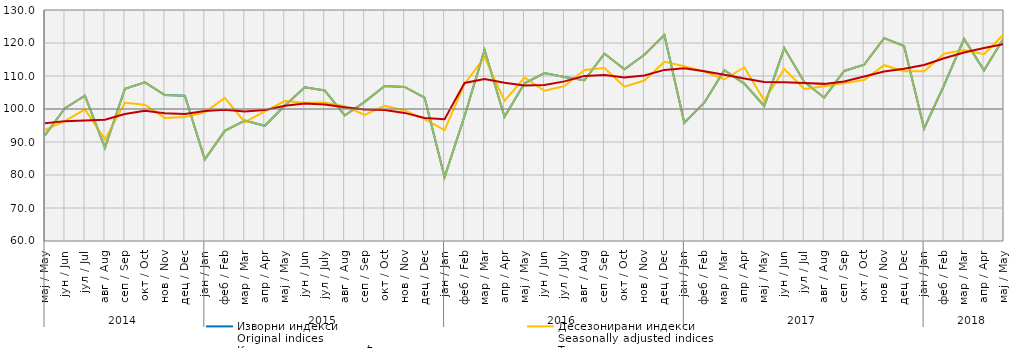
| Category | Изворни индекси
Original indices | Десезонирани индекси
Seasonally adjusted indices | Календарски прилагођени индекси
Working-day adjusted indices | Тренд
Trend |
|---|---|---|---|---|
| 0 | 92.073 | 93.652 | 92.073 | 95.713 |
| 1 | 100.223 | 96.353 | 100.223 | 96.325 |
| 2 | 104.036 | 99.883 | 104.036 | 96.519 |
| 3 | 88.225 | 90.789 | 88.225 | 96.746 |
| 4 | 106.132 | 101.86 | 106.132 | 98.466 |
| 5 | 108.074 | 101.318 | 108.074 | 99.43 |
| 6 | 104.242 | 97.289 | 104.242 | 98.74 |
| 7 | 104.032 | 97.553 | 104.032 | 98.503 |
| 8 | 84.716 | 98.988 | 84.716 | 99.367 |
| 9 | 93.365 | 103.385 | 93.365 | 99.771 |
| 10 | 96.491 | 95.997 | 96.491 | 99.22 |
| 11 | 94.914 | 99.28 | 94.914 | 99.662 |
| 12 | 101.001 | 102.419 | 101.001 | 101.003 |
| 13 | 106.571 | 101.867 | 106.571 | 101.669 |
| 14 | 105.634 | 101.936 | 105.634 | 101.375 |
| 15 | 98.032 | 100.837 | 98.032 | 100.512 |
| 16 | 102.175 | 98.177 | 102.175 | 99.874 |
| 17 | 106.973 | 100.995 | 106.973 | 99.687 |
| 18 | 106.679 | 99.573 | 106.679 | 98.819 |
| 19 | 103.448 | 96.906 | 103.448 | 97.266 |
| 20 | 79.358 | 93.597 | 79.358 | 96.884 |
| 21 | 97.898 | 107.611 | 97.898 | 107.887 |
| 22 | 117.913 | 115.709 | 117.913 | 109.075 |
| 23 | 97.629 | 102.486 | 97.629 | 107.977 |
| 24 | 107.793 | 109.515 | 107.793 | 107.156 |
| 25 | 110.869 | 105.527 | 110.869 | 107.248 |
| 26 | 109.684 | 106.917 | 109.684 | 108.373 |
| 27 | 108.719 | 111.819 | 108.719 | 110.038 |
| 28 | 116.799 | 112.408 | 116.799 | 110.275 |
| 29 | 112.011 | 106.748 | 112.011 | 109.51 |
| 30 | 116.451 | 108.613 | 116.451 | 110.152 |
| 31 | 122.432 | 114.291 | 122.432 | 111.848 |
| 32 | 95.812 | 112.985 | 95.812 | 112.337 |
| 33 | 101.907 | 111.357 | 101.907 | 111.438 |
| 34 | 111.746 | 108.942 | 111.746 | 110.388 |
| 35 | 107.7 | 112.647 | 107.7 | 109.213 |
| 36 | 100.901 | 102.57 | 100.901 | 108.16 |
| 37 | 118.466 | 112.097 | 118.466 | 108.097 |
| 38 | 108.212 | 106.053 | 108.212 | 107.846 |
| 39 | 103.433 | 106.876 | 103.433 | 107.614 |
| 40 | 111.521 | 107.842 | 111.521 | 108.338 |
| 41 | 113.414 | 108.795 | 113.414 | 109.848 |
| 42 | 121.479 | 113.277 | 121.479 | 111.368 |
| 43 | 119.1 | 111.445 | 119.1 | 112.179 |
| 44 | 94.101 | 111.463 | 94.101 | 113.344 |
| 45 | 107.2 | 116.725 | 107.218 | 115.355 |
| 46 | 121.246 | 117.883 | 121.246 | 117.101 |
| 47 | 111.733 | 116.62 | 111.733 | 118.487 |
| 48 | 121.596 | 122.737 | 121.596 | 119.65 |